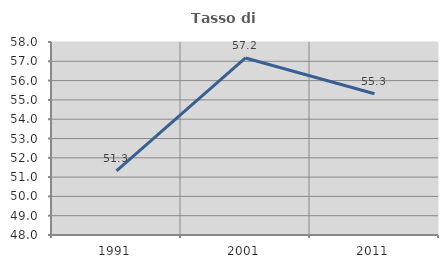
| Category | Tasso di occupazione   |
|---|---|
| 1991.0 | 51.322 |
| 2001.0 | 57.173 |
| 2011.0 | 55.32 |